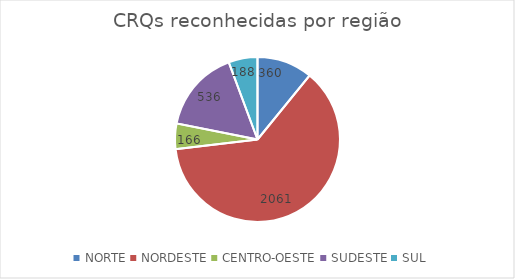
| Category | Series 0 |
|---|---|
| NORTE | 360 |
| NORDESTE | 2061 |
| CENTRO-OESTE | 166 |
| SUDESTE | 536 |
| SUL | 188 |